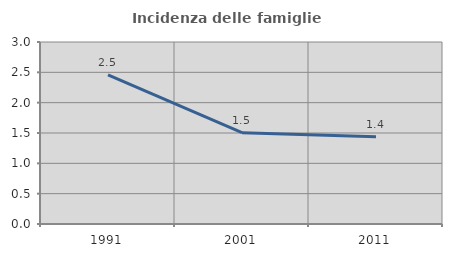
| Category | Incidenza delle famiglie numerose |
|---|---|
| 1991.0 | 2.457 |
| 2001.0 | 1.505 |
| 2011.0 | 1.437 |